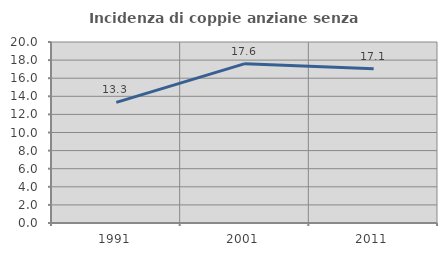
| Category | Incidenza di coppie anziane senza figli  |
|---|---|
| 1991.0 | 13.329 |
| 2001.0 | 17.604 |
| 2011.0 | 17.051 |